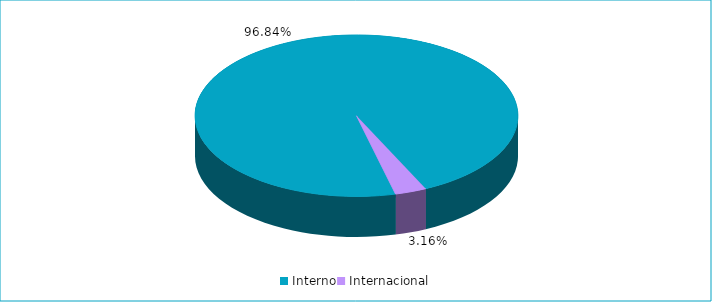
| Category | Series 0 |
|---|---|
| Interno | 0.968 |
| Internacional | 0.032 |